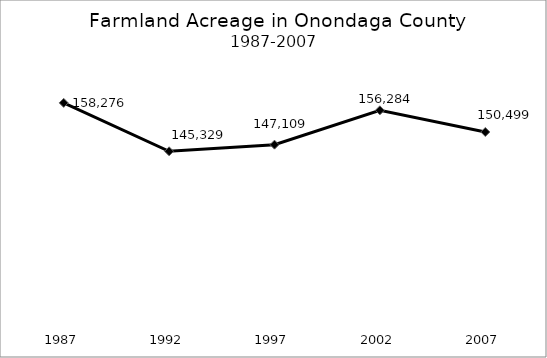
| Category | Farm Acreage |
|---|---|
| 1987.0 | 158276 |
| 1992.0 | 145329 |
| 1997.0 | 147109 |
| 2002.0 | 156284 |
| 2007.0 | 150499 |